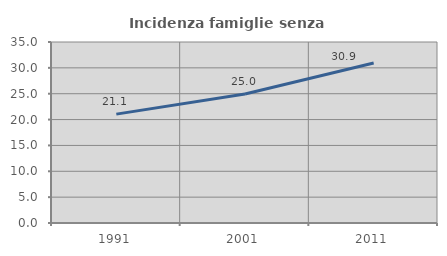
| Category | Incidenza famiglie senza nuclei |
|---|---|
| 1991.0 | 21.051 |
| 2001.0 | 24.958 |
| 2011.0 | 30.924 |